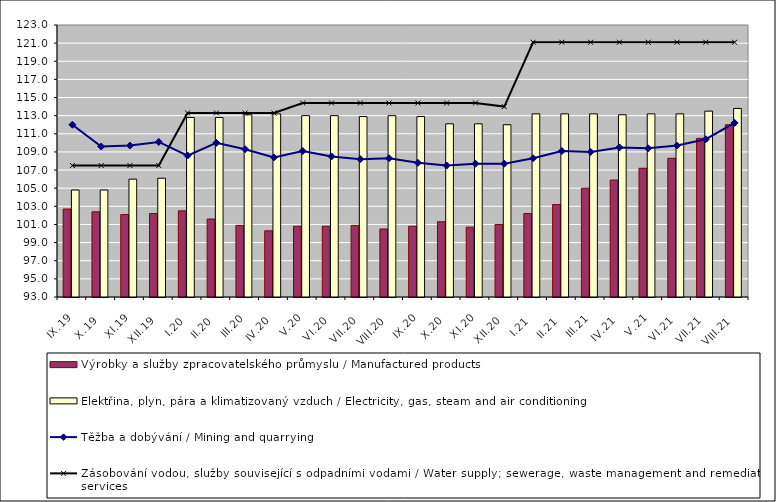
| Category | Výrobky a služby zpracovatelského průmyslu / Manufactured products | Elektřina, plyn, pára a klimatizovaný vzduch / Electricity, gas, steam and air conditioning |
|---|---|---|
| IX.19 | 102.7 | 104.8 |
| X.19 | 102.4 | 104.8 |
| XI.19 | 102.1 | 106 |
| XII.19 | 102.2 | 106.1 |
| I.20 | 102.5 | 112.8 |
| II.20 | 101.6 | 112.8 |
| III.20 | 100.9 | 113.1 |
| IV.20 | 100.3 | 113.2 |
| V.20 | 100.8 | 113 |
| VI.20 | 100.8 | 113 |
| VII.20 | 100.9 | 112.9 |
| VIII.20 | 100.5 | 113 |
| IX.20 | 100.8 | 112.9 |
| X.20 | 101.3 | 112.1 |
| XI.20 | 100.7 | 112.1 |
| XII.20 | 101 | 112 |
| I.21 | 102.2 | 113.2 |
| II.21 | 103.2 | 113.2 |
| III.21 | 105 | 113.2 |
| IV.21 | 105.9 | 113.1 |
| V.21 | 107.2 | 113.2 |
| VI.21 | 108.3 | 113.2 |
| VII.21 | 110.5 | 113.5 |
| VIII.21 | 112 | 113.8 |